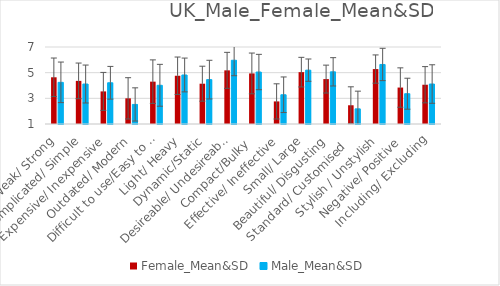
| Category | Female_Mean&SD | Male_Mean&SD |
|---|---|---|
| Weak/ Strong | 4.64 | 4.246 |
| Complicated/ Simple | 4.36 | 4.115 |
| Expensive/ Inexpensive | 3.54 | 4.213 |
| Outdated/ Modern | 3 | 2.525 |
| Difficult to use/Easy to use | 4.3 | 4.016 |
| Light/ Heavy | 4.76 | 4.82 |
| Dynamic/Static | 4.14 | 4.459 |
| Desireable/ Undesireable | 5.18 | 5.967 |
| Compact/Bulky  | 4.94 | 5.049 |
| Effective/ Ineffective | 2.76 | 3.279 |
| Small/ Large | 5.04 | 5.197 |
| Beautiful/ Disgusting | 4.5 | 5.066 |
| Standard/ Customised   | 2.46 | 2.18 |
| Stylish / Unstylish | 5.28 | 5.639 |
| Negative/ Positive | 3.84 | 3.361 |
| Including/ Excluding | 4.06 | 4.115 |